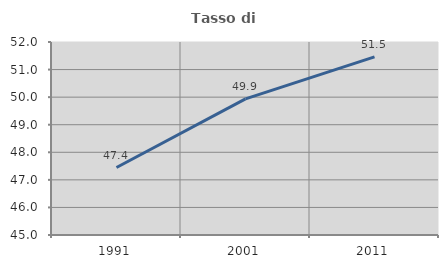
| Category | Tasso di occupazione   |
|---|---|
| 1991.0 | 47.447 |
| 2001.0 | 49.937 |
| 2011.0 | 51.463 |